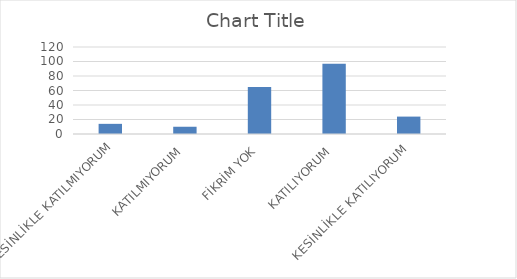
| Category | Series 0 |
|---|---|
| KESİNLİKLE KATILMIYORUM | 14 |
| KATILMIYORUM | 10 |
| FİKRİM YOK | 65 |
| KATILIYORUM | 97 |
| KESİNLİKLE KATILIYORUM | 24 |